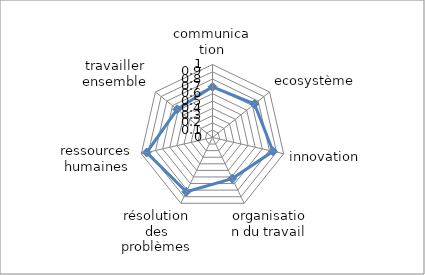
| Category | Series 0 |
|---|---|
| communication | 0.695 |
| ecosystème | 0.736 |
| innovation | 0.85 |
| organisation du travail | 0.625 |
| résolution des problèmes | 0.825 |
| ressources humaines | 0.925 |
| travailler ensemble | 0.62 |